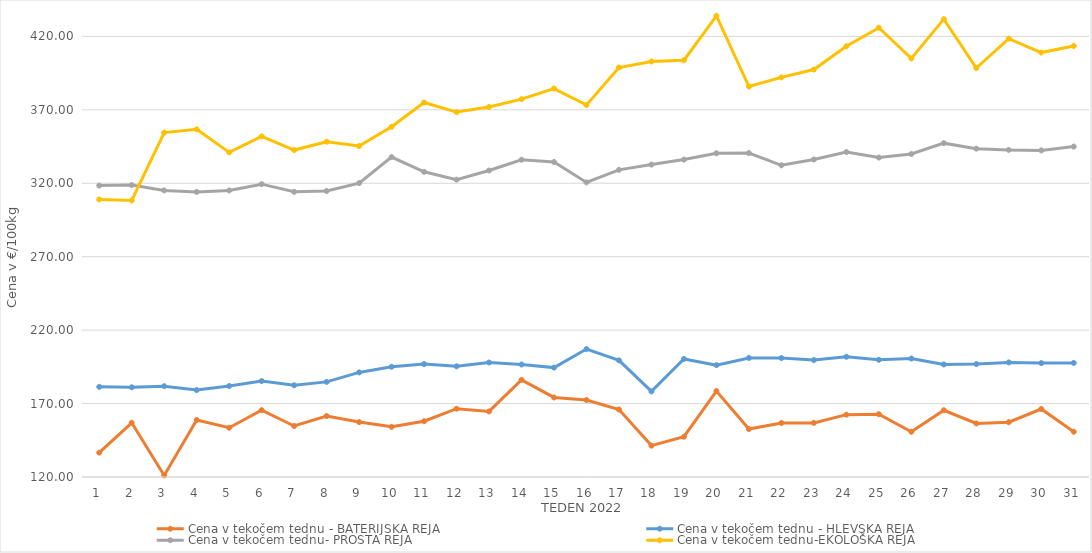
| Category | Cena v tekočem tednu - BATERIJSKA REJA | Cena v tekočem tednu - HLEVSKA REJA | Cena v tekočem tednu- PROSTA REJA | Cena v tekočem tednu-EKOLOŠKA REJA |
|---|---|---|---|---|
| 1.0 | 136.59 | 181.38 | 318.4 | 308.97 |
| 2.0 | 156.88 | 181.07 | 318.82 | 308.28 |
| 3.0 | 121.07 | 181.83 | 315.14 | 354.48 |
| 4.0 | 158.82 | 179.22 | 314.08 | 356.72 |
| 5.0 | 153.55 | 181.96 | 315.1 | 341.03 |
| 6.0 | 165.51 | 185.31 | 319.38 | 351.9 |
| 7.0 | 154.74 | 182.45 | 314.16 | 342.59 |
| 8.0 | 161.48 | 184.77 | 314.71 | 348.28 |
| 9.0 | 157.38 | 191.21 | 320.1 | 345.35 |
| 10.0 | 154.16 | 195.04 | 337.83 | 358.45 |
| 11.0 | 157.96 | 196.88 | 327.79 | 375 |
| 12.0 | 166.49 | 195.36 | 322.46 | 368.45 |
| 13.0 | 164.66 | 197.95 | 328.67 | 371.9 |
| 14.0 | 186.11 | 196.59 | 336.02 | 377.24 |
| 15.0 | 174.18 | 194.49 | 334.46 | 384.48 |
| 16.0 | 172.42 | 207.1 | 320.58 | 373.28 |
| 17.0 | 165.96 | 199.41 | 329.11 | 398.79 |
| 18.0 | 141.36 | 178.29 | 332.71 | 402.93 |
| 19.0 | 147.43 | 200.37 | 336.11 | 403.79 |
| 20.0 | 178.51 | 196.16 | 340.4 | 433.97 |
| 21.0 | 152.67 | 201.05 | 340.55 | 385.86 |
| 22.0 | 156.8 | 200.98 | 332.23 | 392.07 |
| 23.0 | 156.84 | 199.63 | 336.16 | 397.41 |
| 24.0 | 162.44 | 201.86 | 341.24 | 413.28 |
| 25.0 | 162.78 | 199.81 | 337.48 | 425.86 |
| 26.0 | 150.82 | 200.65 | 339.9 | 405 |
| 27.0 | 165.45 | 196.64 | 347.3 | 431.72 |
| 28.0 | 156.46 | 196.88 | 343.56 | 398.45 |
| 29.0 | 157.31 | 198.03 | 342.71 | 418.45 |
| 30.0 | 166.29 | 197.55 | 342.35 | 408.97 |
| 31.0 | 150.81 | 197.66 | 344.97 | 413.45 |